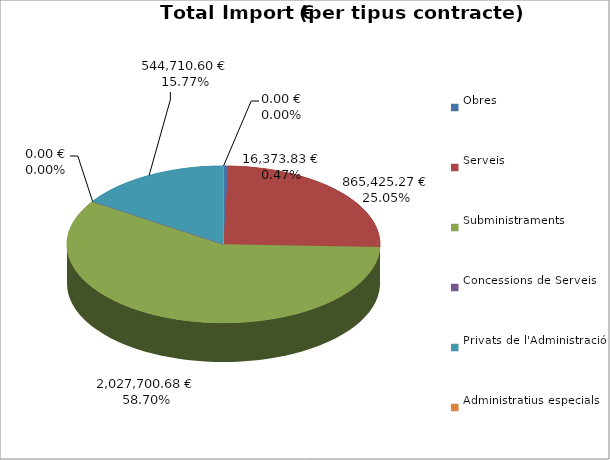
| Category | Total preu
(amb IVA) |
|---|---|
| Obres | 16373.83 |
| Serveis | 865425.27 |
| Subministraments | 2027700.68 |
| Concessions de Serveis | 0 |
| Privats de l'Administració | 544710.6 |
| Administratius especials | 0 |